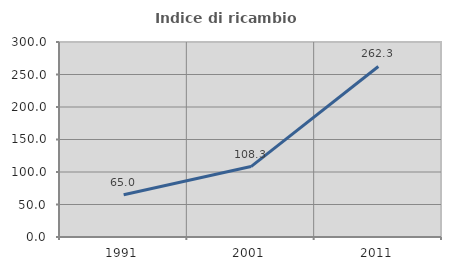
| Category | Indice di ricambio occupazionale  |
|---|---|
| 1991.0 | 65 |
| 2001.0 | 108.333 |
| 2011.0 | 262.338 |